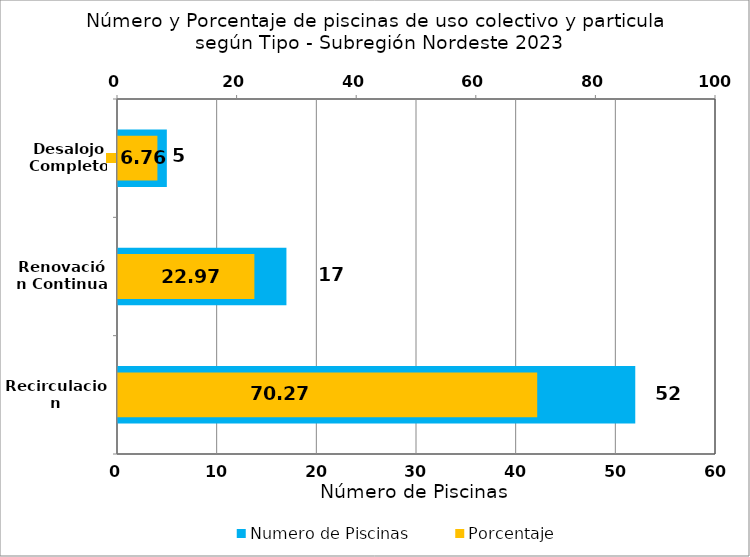
| Category | Numero de Piscinas |
|---|---|
| Recirculacion | 52 |
| Renovación Continua | 17 |
| Desalojo Completo | 5 |